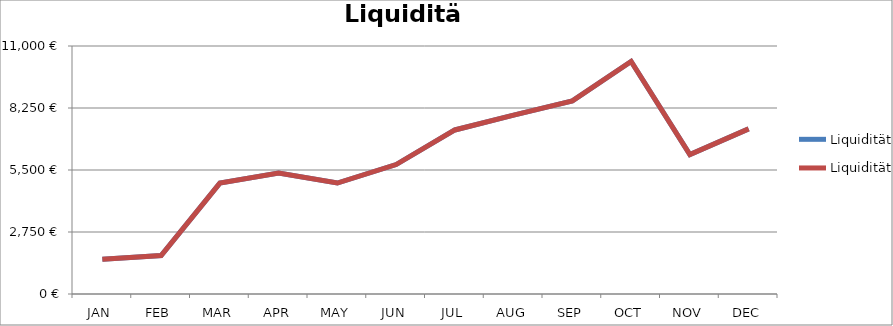
| Category | Liquidität |
|---|---|
| JAN | 1539 |
| FEB | 1705 |
| MAR | 4921 |
| APR | 5370 |
| MAY | 4921 |
| JUN | 5742 |
| JUL | 7276 |
| AUG | 7937 |
| SEP | 8568 |
| OCT | 10312 |
| NOV | 6183 |
| DEC | 7324 |